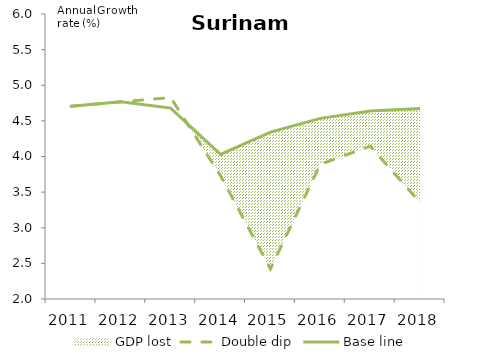
| Category | Double dip | Base line |
|---|---|---|
| 2011.0 | 4.705 | 4.705 |
| 2012.0 | 4.767 | 4.767 |
| 2013.0 | 4.827 | 4.679 |
| 2014.0 | 3.728 | 4.03 |
| 2015.0 | 2.421 | 4.343 |
| 2016.0 | 3.891 | 4.535 |
| 2017.0 | 4.144 | 4.64 |
| 2018.0 | 3.355 | 4.673 |